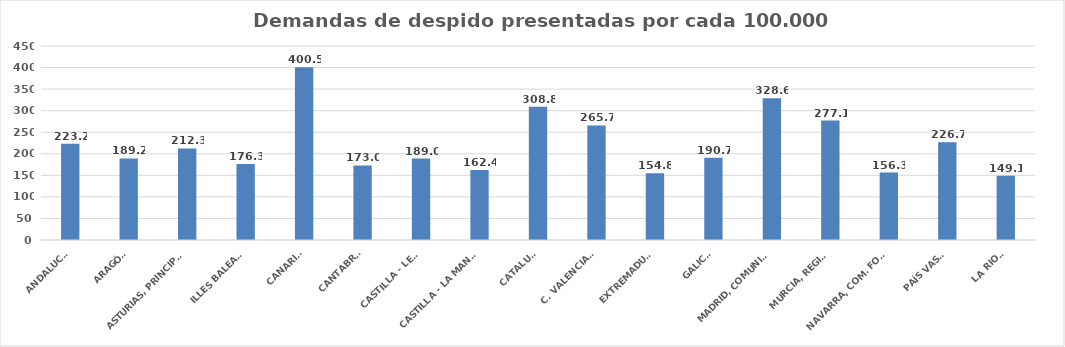
| Category | Series 0 |
|---|---|
| ANDALUCÍA | 223.211 |
| ARAGÓN | 189.246 |
| ASTURIAS, PRINCIPADO | 212.305 |
| ILLES BALEARS | 176.347 |
| CANARIAS | 400.468 |
| CANTABRIA | 173.043 |
| CASTILLA - LEÓN | 188.988 |
| CASTILLA - LA MANCHA | 162.371 |
| CATALUÑA | 308.805 |
| C. VALENCIANA | 265.655 |
| EXTREMADURA | 154.82 |
| GALICIA | 190.711 |
| MADRID, COMUNIDAD | 328.576 |
| MURCIA, REGIÓN | 277.111 |
| NAVARRA, COM. FORAL | 156.298 |
| PAÍS VASCO | 226.658 |
| LA RIOJA | 149.113 |